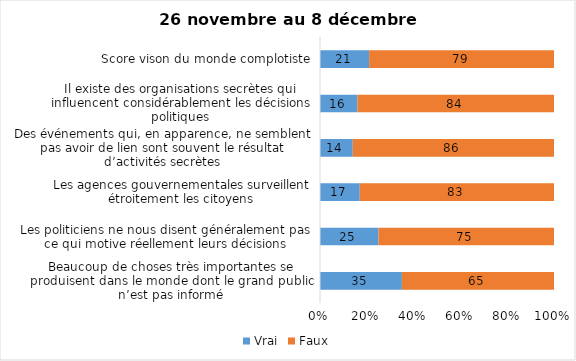
| Category | Vrai | Faux |
|---|---|---|
| Beaucoup de choses très importantes se produisent dans le monde dont le grand public n’est pas informé | 35 | 65 |
| Les politiciens ne nous disent généralement pas ce qui motive réellement leurs décisions | 25 | 75 |
| Les agences gouvernementales surveillent étroitement les citoyens | 17 | 83 |
| Des événements qui, en apparence, ne semblent pas avoir de lien sont souvent le résultat d’activités secrètes | 14 | 86 |
| Il existe des organisations secrètes qui influencent considérablement les décisions politiques | 16 | 84 |
| Score vison du monde complotiste | 21 | 79 |